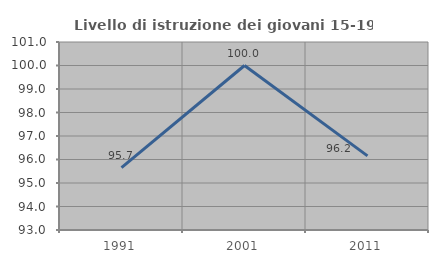
| Category | Livello di istruzione dei giovani 15-19 anni |
|---|---|
| 1991.0 | 95.652 |
| 2001.0 | 100 |
| 2011.0 | 96.154 |